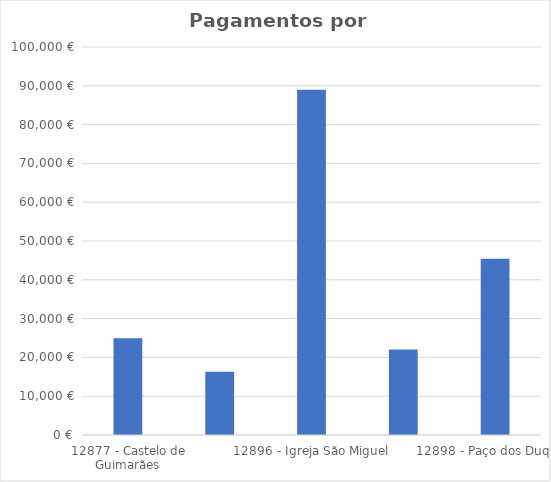
| Category | Total |
|---|---|
| 12877 - Castelo de Guimarães | 24918.6 |
| 12894 - Concatedral Miranda do Douro | 16272.9 |
| 12896 - Igreja São Miguel | 89007.02 |
| 12897 - Museu Alberto Sampaio | 22029.3 |
| 12898 - Paço dos Duques | 45448.5 |